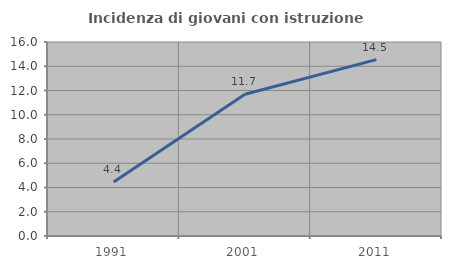
| Category | Incidenza di giovani con istruzione universitaria |
|---|---|
| 1991.0 | 4.444 |
| 2001.0 | 11.688 |
| 2011.0 | 14.545 |